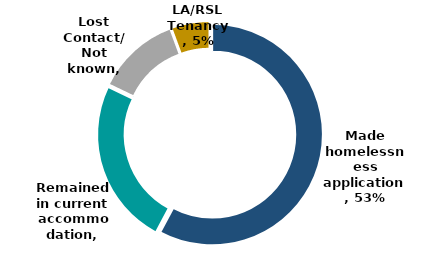
| Category | Series 0 |
|---|---|
| Made homelessness application | 0.531 |
| Remained in current accommodation | 0.224 |
| Lost Contact/ Not known | 0.113 |
| LA/RSL Tenancy | 0.052 |